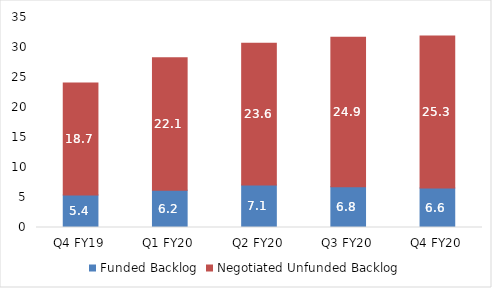
| Category | Funded Backlog | Negotiated Unfunded Backlog |
|---|---|---|
| Q4 FY19 | 5.4 | 18.7 |
| Q1 FY20 | 6.2 | 22.1 |
| Q2 FY20 | 7.1 | 23.6 |
| Q3 FY20 | 6.8 | 24.9 |
| Q4 FY20 | 6.6 | 25.3 |